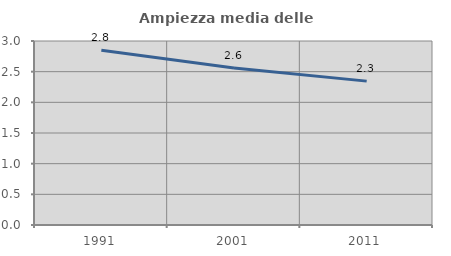
| Category | Ampiezza media delle famiglie |
|---|---|
| 1991.0 | 2.848 |
| 2001.0 | 2.559 |
| 2011.0 | 2.346 |